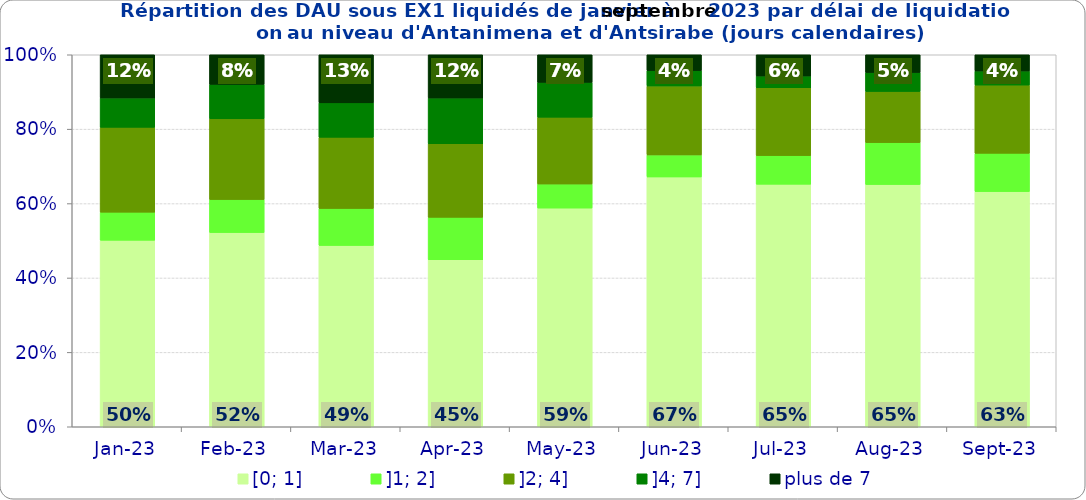
| Category | [0; 1] | ]1; 2] | ]2; 4] | ]4; 7] | plus de 7 |
|---|---|---|---|---|---|
| 2023-01-01 | 0.501 | 0.076 | 0.228 | 0.079 | 0.116 |
| 2023-02-01 | 0.522 | 0.089 | 0.217 | 0.093 | 0.08 |
| 2023-03-01 | 0.487 | 0.1 | 0.191 | 0.092 | 0.129 |
| 2023-04-01 | 0.449 | 0.114 | 0.198 | 0.123 | 0.116 |
| 2023-05-01 | 0.588 | 0.065 | 0.18 | 0.094 | 0.074 |
| 2023-06-01 | 0.672 | 0.059 | 0.185 | 0.041 | 0.043 |
| 2023-07-01 | 0.652 | 0.077 | 0.182 | 0.032 | 0.057 |
| 2023-08-01 | 0.651 | 0.113 | 0.137 | 0.051 | 0.048 |
| 2023-09-01 | 0.632 | 0.103 | 0.183 | 0.038 | 0.044 |